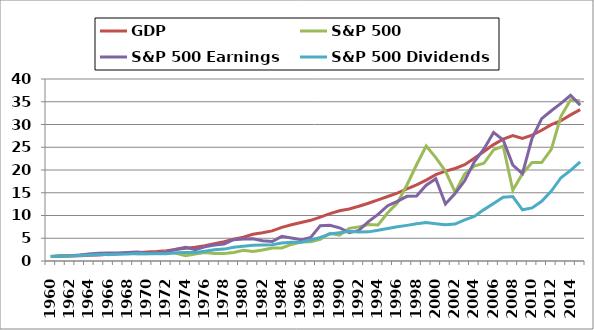
| Category | GDP | S&P 500 | S&P 500 Earnings | S&P 500 Dividends |
|---|---|---|---|---|
| 1960.0 | 1 | 1 | 1 | 1 |
| 1961.0 | 1.023 | 1.231 | 1.086 | 1.029 |
| 1962.0 | 1.097 | 1.086 | 1.181 | 1.083 |
| 1963.0 | 1.157 | 1.291 | 1.332 | 1.185 |
| 1964.0 | 1.239 | 1.458 | 1.535 | 1.304 |
| 1965.0 | 1.328 | 1.591 | 1.707 | 1.427 |
| 1966.0 | 1.461 | 1.382 | 1.745 | 1.455 |
| 1967.0 | 1.566 | 1.66 | 1.76 | 1.504 |
| 1968.0 | 1.681 | 1.787 | 1.844 | 1.536 |
| 1969.0 | 1.836 | 1.584 | 1.967 | 1.635 |
| 1970.0 | 1.961 | 1.586 | 1.776 | 1.609 |
| 1971.0 | 2.092 | 1.757 | 1.796 | 1.597 |
| 1972.0 | 2.279 | 2.031 | 1.99 | 1.609 |
| 1973.0 | 2.534 | 1.679 | 2.565 | 1.821 |
| 1974.0 | 2.777 | 1.18 | 3.014 | 1.879 |
| 1975.0 | 3.01 | 1.552 | 2.485 | 1.884 |
| 1976.0 | 3.346 | 1.849 | 3.141 | 2.131 |
| 1977.0 | 3.791 | 1.637 | 3.503 | 2.452 |
| 1978.0 | 4.258 | 1.654 | 3.751 | 2.614 |
| 1979.0 | 4.803 | 1.858 | 4.689 | 3.012 |
| 1980.0 | 5.227 | 2.336 | 4.83 | 3.247 |
| 1981.0 | 5.865 | 2.109 | 4.893 | 3.445 |
| 1982.0 | 6.193 | 2.42 | 4.455 | 3.499 |
| 1983.0 | 6.618 | 2.838 | 4.284 | 3.596 |
| 1984.0 | 7.387 | 2.878 | 5.427 | 3.95 |
| 1985.0 | 7.981 | 3.636 | 5.052 | 4.137 |
| 1986.0 | 8.477 | 4.167 | 4.651 | 4.131 |
| 1987.0 | 8.936 | 4.252 | 5.168 | 4.626 |
| 1988.0 | 9.634 | 4.779 | 7.773 | 5.158 |
| 1989.0 | 10.409 | 6.082 | 7.837 | 5.921 |
| 1990.0 | 11.053 | 5.683 | 7.299 | 6.233 |
| 1991.0 | 11.419 | 7.178 | 6.22 | 6.546 |
| 1992.0 | 12.025 | 7.498 | 6.726 | 6.377 |
| 1993.0 | 12.698 | 8.027 | 8.669 | 6.403 |
| 1994.0 | 13.451 | 7.903 | 10.232 | 6.745 |
| 1995.0 | 14.172 | 10.599 | 12.149 | 7.149 |
| 1996.0 | 14.91 | 12.747 | 13.093 | 7.514 |
| 1997.0 | 15.853 | 16.7 | 14.208 | 7.833 |
| 1998.0 | 16.735 | 21.154 | 14.266 | 8.175 |
| 1999.0 | 17.773 | 25.284 | 16.654 | 8.434 |
| 2000.0 | 18.965 | 22.72 | 18.089 | 8.21 |
| 2001.0 | 19.743 | 19.757 | 12.52 | 7.944 |
| 2002.0 | 20.327 | 15.141 | 14.837 | 8.115 |
| 2003.0 | 21.178 | 19.135 | 17.624 | 9.023 |
| 2004.0 | 22.591 | 20.856 | 21.811 | 9.794 |
| 2005.0 | 24.087 | 21.482 | 24.637 | 11.294 |
| 2006.0 | 25.574 | 24.407 | 28.269 | 12.642 |
| 2007.0 | 26.767 | 25.269 | 26.599 | 13.994 |
| 2008.0 | 27.569 | 15.544 | 21.073 | 14.156 |
| 2009.0 | 26.938 | 19.189 | 19.223 | 11.259 |
| 2010.0 | 27.656 | 21.642 | 26.96 | 11.668 |
| 2011.0 | 28.741 | 21.642 | 31.275 | 13.131 |
| 2012.0 | 29.952 | 24.543 | 33.022 | 15.362 |
| 2013.0 | 30.832 | 31.808 | 34.627 | 18.309 |
| 2014.0 | 32.113 | 35.431 | 36.419 | 19.904 |
| 2015.0 | 33.271 | 35.174 | 34.263 | 21.781 |